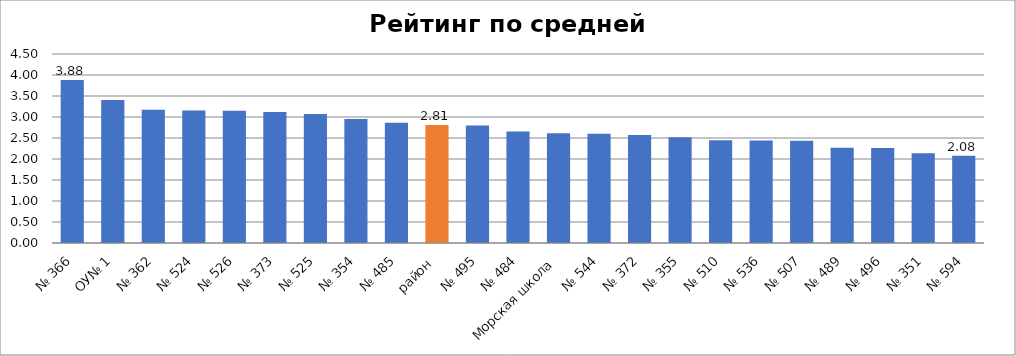
| Category | Оценка |
|---|---|
| № 366 | 3.88 |
| ОУ№ 1 | 3.407 |
| № 362 | 3.173 |
| № 524 | 3.157 |
| № 526 | 3.15 |
| № 373 | 3.12 |
| № 525 | 3.07 |
| № 354 | 2.955 |
| № 485 | 2.861 |
| район | 2.809 |
| № 495 | 2.8 |
| № 484 | 2.654 |
| Морская школа | 2.611 |
| № 544 | 2.598 |
| № 372 | 2.571 |
| № 355 | 2.521 |
| № 510 | 2.447 |
| № 536 | 2.44 |
| № 507 | 2.432 |
| № 489 | 2.269 |
| № 496 | 2.259 |
| № 351 | 2.14 |
| № 594 | 2.078 |